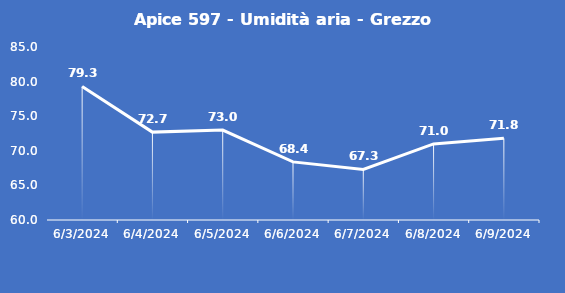
| Category | Apice 597 - Umidità aria - Grezzo (%) |
|---|---|
| 6/3/24 | 79.3 |
| 6/4/24 | 72.7 |
| 6/5/24 | 73 |
| 6/6/24 | 68.4 |
| 6/7/24 | 67.3 |
| 6/8/24 | 71 |
| 6/9/24 | 71.8 |